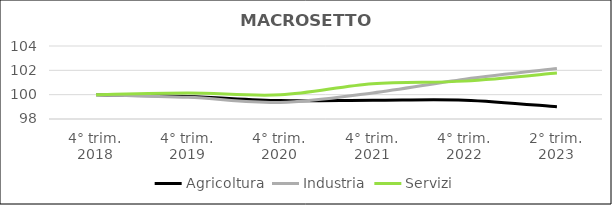
| Category | Agricoltura | Industria | Servizi |
|---|---|---|---|
| 4° trim.
2018 | 100 | 100 | 100 |
| 4° trim.
2019 | 99.848 | 99.778 | 100.135 |
| 4° trim.
2020 | 99.516 | 99.363 | 99.989 |
| 4° trim.
2021 | 99.543 | 100.143 | 100.904 |
| 4° trim.
2022 | 99.55 | 101.275 | 101.113 |
| 2° trim.
2023 | 99.006 | 102.146 | 101.777 |